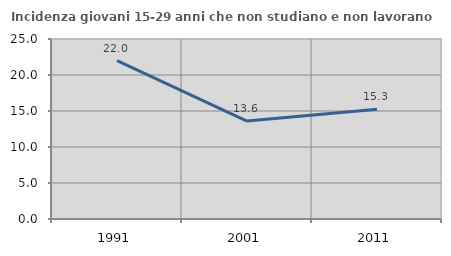
| Category | Incidenza giovani 15-29 anni che non studiano e non lavorano  |
|---|---|
| 1991.0 | 21.983 |
| 2001.0 | 13.605 |
| 2011.0 | 15.254 |